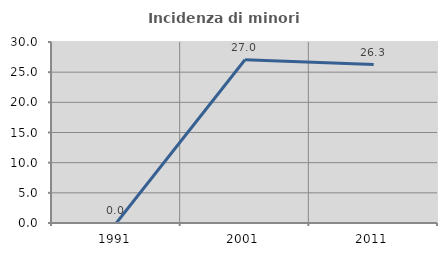
| Category | Incidenza di minori stranieri |
|---|---|
| 1991.0 | 0 |
| 2001.0 | 27.049 |
| 2011.0 | 26.257 |